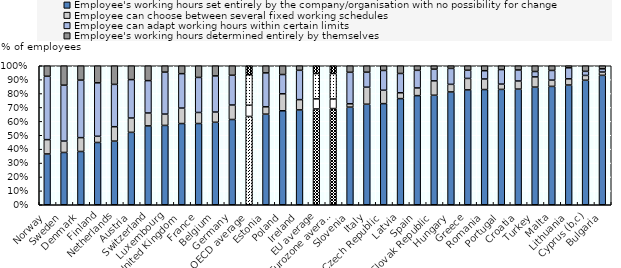
| Category | Employee's working hours set entirely by the company/organisation with no possibility for change | Employee can choose between several fixed working schedules | Employee can adapt working hours within certain limits | Employee's working hours determined entirely by themselves |
|---|---|---|---|---|
| Norway | 0.365 | 0.103 | 0.456 | 0.076 |
| Sweden | 0.376 | 0.082 | 0.402 | 0.14 |
| Denmark | 0.383 | 0.1 | 0.414 | 0.103 |
| Finland | 0.448 | 0.045 | 0.384 | 0.123 |
| Netherlands | 0.458 | 0.104 | 0.304 | 0.134 |
| Austria | 0.521 | 0.103 | 0.276 | 0.1 |
| Switzerland | 0.567 | 0.093 | 0.233 | 0.107 |
| Luxembourg | 0.571 | 0.081 | 0.302 | 0.046 |
| United Kingdom | 0.584 | 0.111 | 0.248 | 0.057 |
| France | 0.585 | 0.079 | 0.252 | 0.084 |
| Belgium | 0.593 | 0.074 | 0.26 | 0.073 |
| Germany | 0.613 | 0.104 | 0.214 | 0.068 |
| OECD average | 0.635 | 0.081 | 0.219 | 0.065 |
| Estonia | 0.652 | 0.053 | 0.244 | 0.051 |
| Poland | 0.676 | 0.122 | 0.139 | 0.063 |
| Ireland | 0.682 | 0.074 | 0.211 | 0.033 |
| EU average | 0.689 | 0.073 | 0.182 | 0.056 |
| Eurozone average | 0.692 | 0.069 | 0.183 | 0.056 |
| Slovenia | 0.702 | 0.024 | 0.227 | 0.047 |
| Italy | 0.723 | 0.123 | 0.108 | 0.046 |
| Czech Republic | 0.728 | 0.096 | 0.142 | 0.034 |
| Latvia | 0.764 | 0.042 | 0.139 | 0.056 |
| Spain | 0.785 | 0.055 | 0.127 | 0.033 |
| Slovak Republic | 0.788 | 0.104 | 0.084 | 0.025 |
| Hungary | 0.812 | 0.055 | 0.115 | 0.019 |
| Greece | 0.826 | 0.082 | 0.059 | 0.032 |
| Romania | 0.829 | 0.076 | 0.06 | 0.036 |
| Portugal | 0.83 | 0.038 | 0.104 | 0.028 |
| Croatia | 0.832 | 0.058 | 0.079 | 0.03 |
| Turkey | 0.846 | 0.074 | 0.039 | 0.041 |
| Malta | 0.852 | 0.045 | 0.07 | 0.034 |
| Lithuania | 0.861 | 0.045 | 0.079 | 0.015 |
| Cyprus (b,c) | 0.896 | 0.035 | 0.029 | 0.04 |
| Bulgaria | 0.931 | 0.023 | 0.023 | 0.022 |